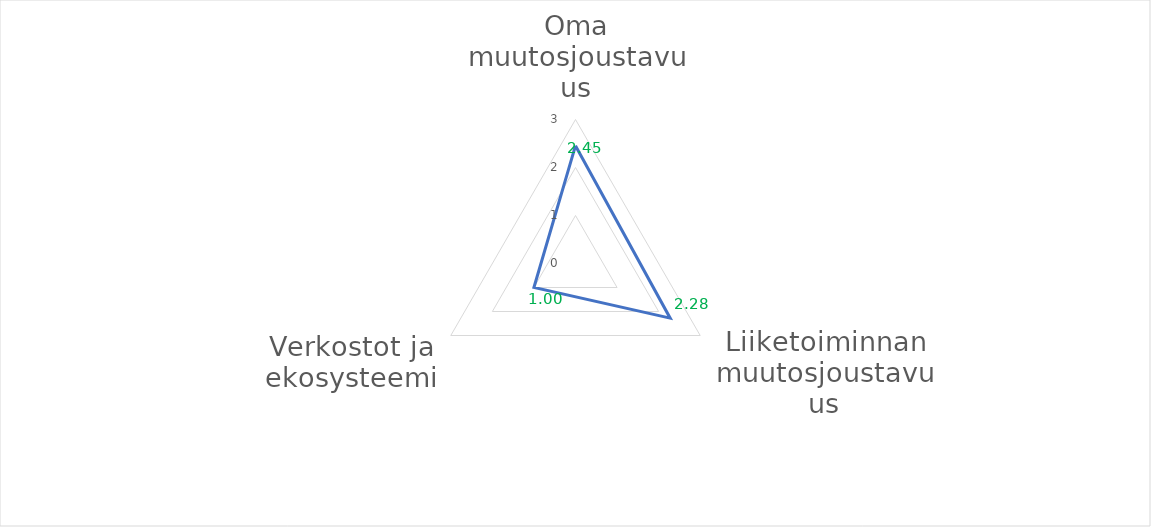
| Category | Series 0 |
|---|---|
| Oma muutosjoustavuus | 2.455 |
| Liiketoiminnan muutosjoustavuus | 2.278 |
| Verkostot ja ekosysteemi | 1 |